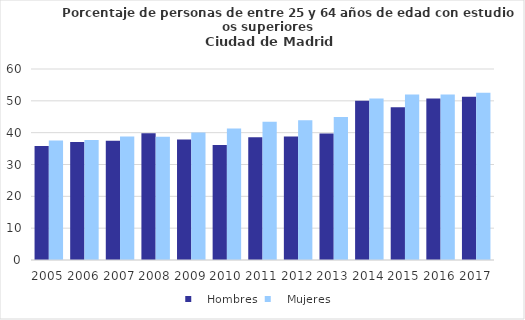
| Category |    Hombres |    Mujeres |
|---|---|---|
| 2005.0 | 35.821 | 37.571 |
| 2006.0 | 37.057 | 37.729 |
| 2007.0 | 37.471 | 38.826 |
| 2008.0 | 39.812 | 38.712 |
| 2009.0 | 37.814 | 40.017 |
| 2010.0 | 36.107 | 41.313 |
| 2011.0 | 38.523 | 43.458 |
| 2012.0 | 38.778 | 43.927 |
| 2013.0 | 39.744 | 44.913 |
| 2014.0 | 50.05 | 50.735 |
| 2015.0 | 48.012 | 52.02 |
| 2016.0 | 50.732 | 52.015 |
| 2017.0 | 51.312 | 52.548 |